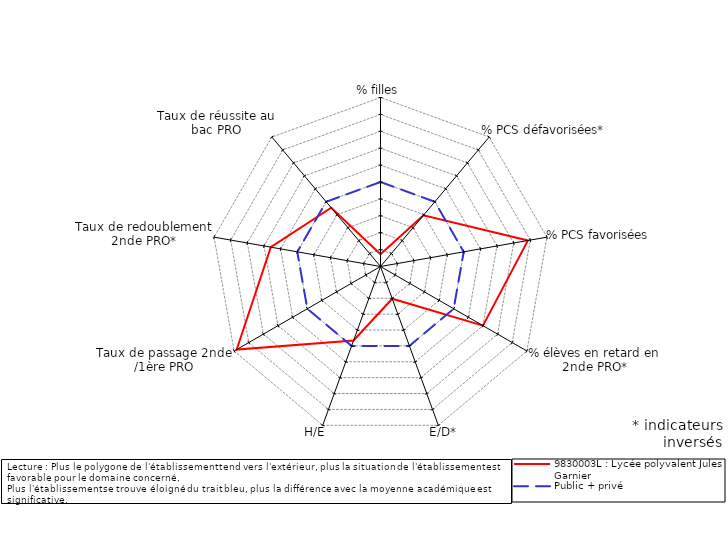
| Category | 9830003L : Lycée polyvalent Jules Garnier | Public + privé |
|---|---|---|
| % filles | -4.273 | 0 |
| % PCS défavorisées* | -1.047 | 0 |
| % PCS favorisées | 3.857 | 0 |
| % élèves en retard en 2nde PRO* | 2 | 0 |
| E/D* | -2.971 | 0 |
| H/E | -0.338 | 0 |
| Taux de passage 2nde /1ère PRO | 4.828 | 0 |
| Taux de redoublement 2nde PRO* | 1.593 | 0 |
| Taux de réussite au bac PRO | -0.464 | 0 |